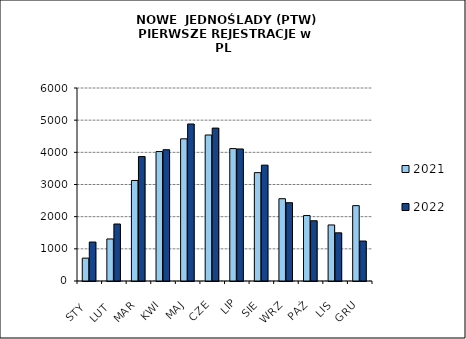
| Category | 2021 | 2022 |
|---|---|---|
|  STY  | 711 | 1211 |
|  LUT  | 1307 | 1772 |
| MAR | 3125 | 3869 |
| KWI | 4024 | 4082 |
| MAJ | 4420 | 4881 |
| CZE | 4539 | 4754 |
| LIP | 4116 | 4105 |
| SIE | 3369 | 3602 |
| WRZ | 2558 | 2434 |
| PAŹ | 2035 | 1873 |
| LIS | 1742 | 1498 |
| GRU | 2343 | 1243 |